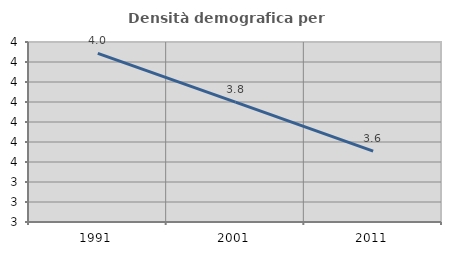
| Category | Densità demografica |
|---|---|
| 1991.0 | 4.043 |
| 2001.0 | 3.799 |
| 2011.0 | 3.555 |